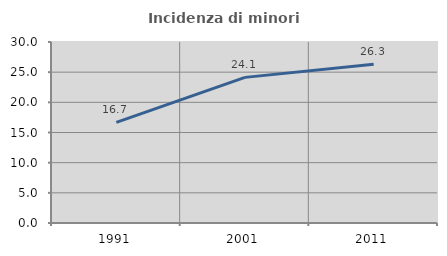
| Category | Incidenza di minori stranieri |
|---|---|
| 1991.0 | 16.667 |
| 2001.0 | 24.138 |
| 2011.0 | 26.316 |